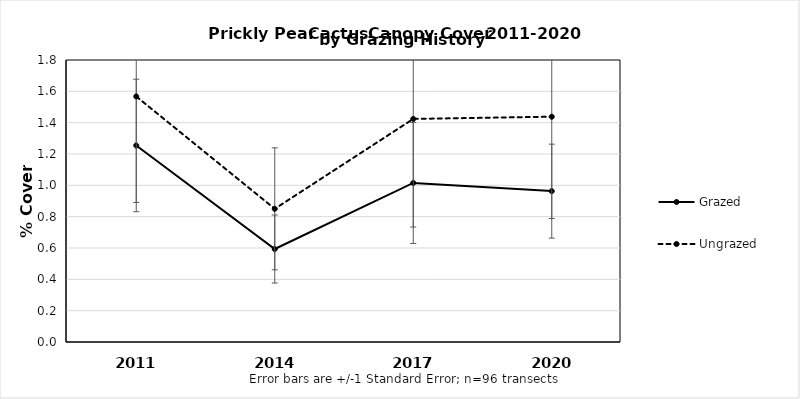
| Category | Grazed | Ungrazed |
|---|---|---|
| 2011.0 | 1.254 | 1.567 |
| 2014.0 | 0.593 | 0.85 |
| 2017.0 | 1.015 | 1.424 |
| 2020.0 | 0.963 | 1.438 |